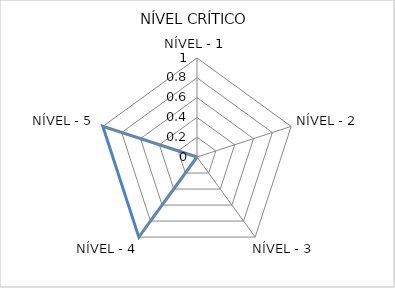
| Category | Series 0 |
|---|---|
| NÍVEL - 1 | 0 |
| NÍVEL - 2 | 0 |
| NÍVEL - 3 | 0 |
| NÍVEL - 4 | 1 |
| NÍVEL - 5 | 1 |